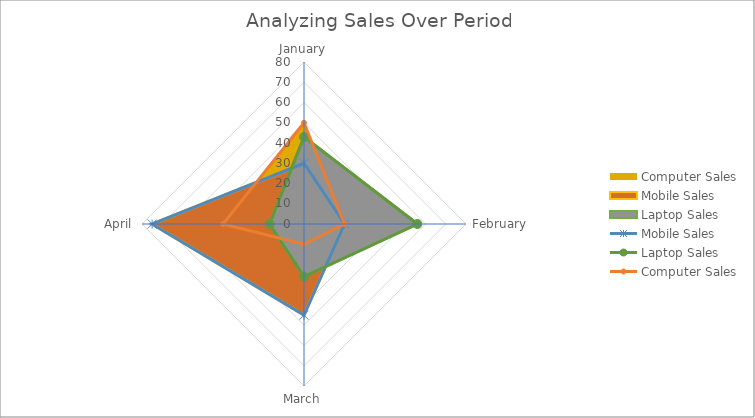
| Category | Computer Sales | Mobile Sales | Laptop Sales |
|---|---|---|---|
| January | 50 | 30 | 43 |
| February | 20 | 20 | 56 |
| March | 10 | 45 | 26 |
| April | 40 | 75 | 17 |